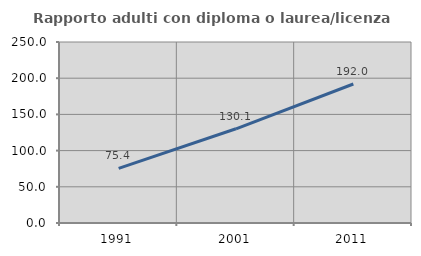
| Category | Rapporto adulti con diploma o laurea/licenza media  |
|---|---|
| 1991.0 | 75.362 |
| 2001.0 | 130.12 |
| 2011.0 | 192 |